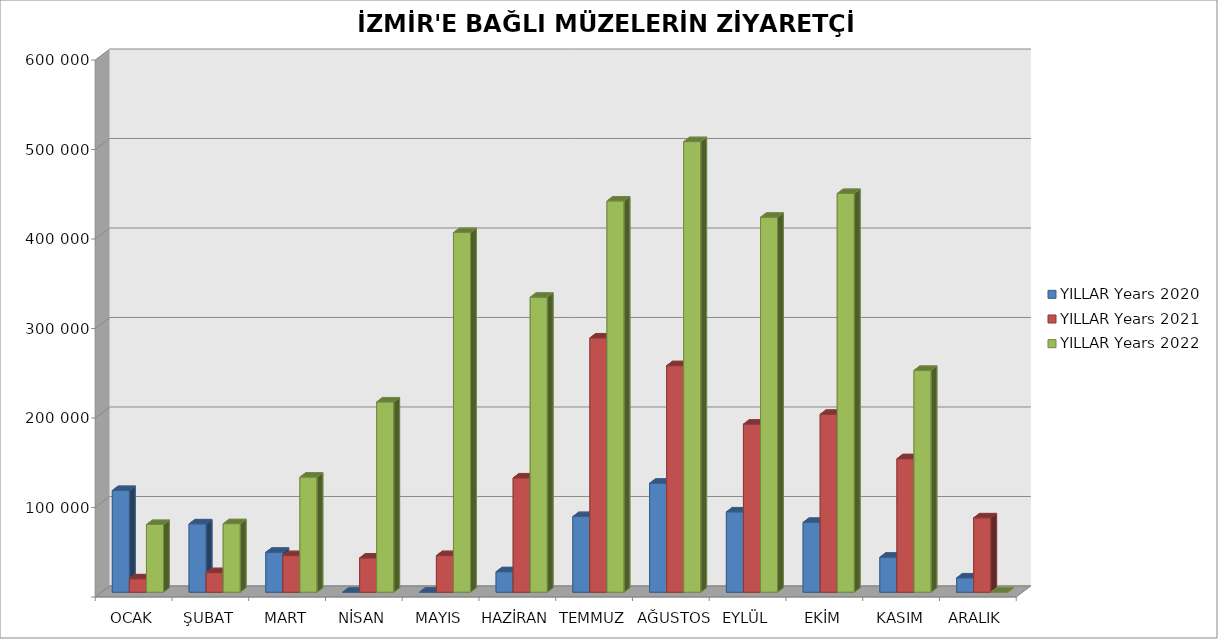
| Category | YILLAR |
|---|---|
| OCAK | 75648 |
| ŞUBAT | 76569 |
| MART | 128664 |
| NİSAN | 212657 |
| MAYIS | 401887 |
| HAZİRAN | 329617 |
| TEMMUZ | 437234 |
| AĞUSTOS | 503510 |
| EYLÜL | 419015 |
| EKİM | 445562 |
| KASIM | 247891 |
| ARALIK | 0 |